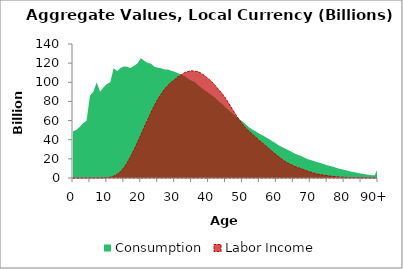
| Category | Consumption | Labor Income |
|---|---|---|
| 0 | 48906.218 | 0 |
|  | 50311.203 | 0 |
| 2 | 53461.416 | 0 |
| 3 | 57323.748 | 0 |
| 4 | 59844.691 | 0 |
| 5 | 85944.439 | 0 |
| 6 | 90101.489 | 46.946 |
| 7 | 99896.379 | 71.583 |
| 8 | 90141.501 | 98.982 |
| 9 | 94846.12 | 169.368 |
| 10 | 98112.99 | 383.668 |
| 11 | 100168.129 | 900.135 |
| 12 | 114804.36 | 1938.554 |
| 13 | 111620.846 | 3772.45 |
| 14 | 114981.073 | 6641.377 |
| 15 | 116600.46 | 10741.076 |
| 16 | 116187.059 | 15990.953 |
| 17 | 114847.794 | 22361.971 |
| 18 | 117276.223 | 29408.418 |
| 19 | 119673.001 | 37003.324 |
| 20 | 125141.186 | 44840.801 |
| 21 | 122478.279 | 52915.05 |
| 22 | 120332.27 | 60647.159 |
| 23 | 119446.382 | 68259.713 |
| 24 | 116257.226 | 75508.783 |
| 25 | 115243.83 | 82174.9 |
| 26 | 114614.56 | 87605.359 |
| 27 | 113472.042 | 92698.509 |
| 28 | 113417.83 | 96749.645 |
| 29 | 111955.377 | 100145.228 |
| 30 | 111046.156 | 102789.907 |
| 31 | 109425.49 | 105932.781 |
| 32 | 108030.17 | 107947.767 |
| 33 | 106390.627 | 110260.514 |
| 34 | 103561.587 | 111241.951 |
| 35 | 101637.949 | 112051.934 |
| 36 | 100118.133 | 111478.611 |
| 37 | 96677.217 | 111097.167 |
| 38 | 93963.466 | 108906.534 |
| 39 | 91284.447 | 106412.982 |
| 40 | 88778.971 | 103414.474 |
| 41 | 86459.514 | 100503.399 |
| 42 | 83615.228 | 96444.801 |
| 43 | 80013.874 | 92238.614 |
| 44 | 77347.613 | 88215.433 |
| 45 | 73641.115 | 83481.748 |
| 46 | 70817.444 | 77862.372 |
| 47 | 67464.66 | 72015.304 |
| 48 | 64559.102 | 66441.164 |
| 49 | 61789.443 | 61001.515 |
| 50 | 59051.92 | 56326.542 |
| 51 | 55924.201 | 52126.915 |
| 52 | 52818.862 | 48601.627 |
| 53 | 50501.782 | 45553.043 |
| 54 | 48531.942 | 42444.606 |
| 55 | 46126.489 | 39066.956 |
| 56 | 44576.009 | 36199.083 |
| 57 | 42332.105 | 33344.336 |
| 58 | 40345.711 | 30132.41 |
| 59 | 38073.412 | 27037.676 |
| 60 | 35879.037 | 24239.085 |
| 61 | 33583.854 | 21426.212 |
| 62 | 31741.267 | 18620.284 |
| 63 | 30080.046 | 16369.853 |
| 64 | 28252.171 | 14540.231 |
| 65 | 26377.647 | 12849.383 |
| 66 | 24671.362 | 11347.032 |
| 67 | 23403.061 | 10158.891 |
| 68 | 21813.214 | 8883.531 |
| 69 | 19999.366 | 7499.773 |
| 70 | 18890.234 | 6278.091 |
| 71 | 17843.556 | 5198.685 |
| 72 | 16707.368 | 4244.907 |
| 73 | 15716.931 | 3521.72 |
| 74 | 14516.334 | 2962.898 |
| 75 | 13345.01 | 2461.327 |
| 76 | 12499.866 | 1987.338 |
| 77 | 11496.45 | 1567.271 |
| 78 | 10244.504 | 1221.629 |
| 79 | 9367.437 | 955.244 |
| 80 | 8547.044 | 737.365 |
| 81 | 7658.456 | 578.327 |
| 82 | 6724.714 | 476.128 |
| 83 | 6049.401 | 370.891 |
| 84 | 5318.878 | 287.265 |
| 85 | 4688.307 | 229.449 |
| 86 | 4005.854 | 188.209 |
| 87 | 3449.743 | 129.729 |
| 88 | 3059.083 | 85.693 |
| 89 | 2717.457 | 52.099 |
| 90+ | 10340.027 | 30.265 |